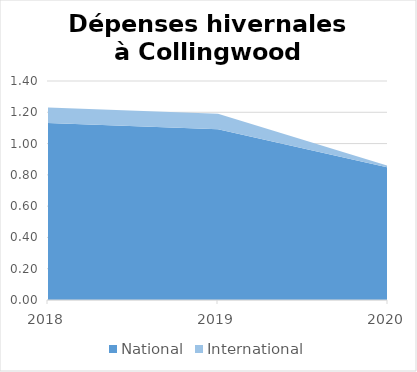
| Category | National | International |
|---|---|---|
| 2018.0 | 1.131 | 0.1 |
| 2019.0 | 1.091 | 0.1 |
| 2020.0 | 0.848 | 0.01 |